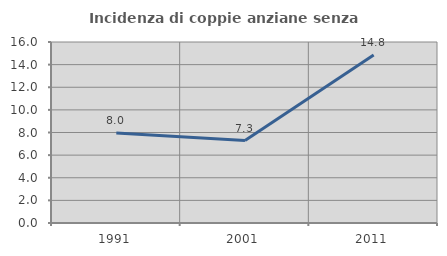
| Category | Incidenza di coppie anziane senza figli  |
|---|---|
| 1991.0 | 7.965 |
| 2001.0 | 7.287 |
| 2011.0 | 14.844 |